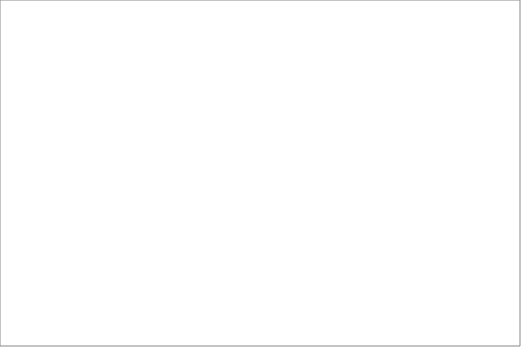
| Category | 2004 | 2005 | 2006 | 2008 | 2009 | 2010 | 2011 | 2012 | 2013 |
|---|---|---|---|---|---|---|---|---|---|
| Afganistan | 2 | 2 |  |  | 2 |  | 2 | 3 | 5 |